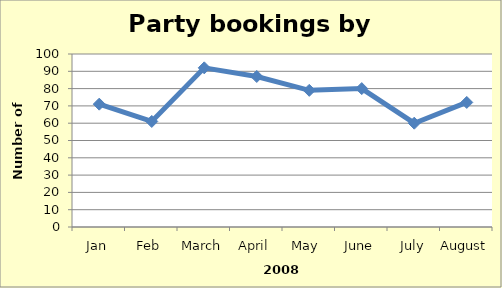
| Category | Series 0 |
|---|---|
| Jan | 71 |
| Feb | 61 |
| March | 92 |
| April | 87 |
| May  | 79 |
| June | 80 |
| July | 60 |
| August | 72 |